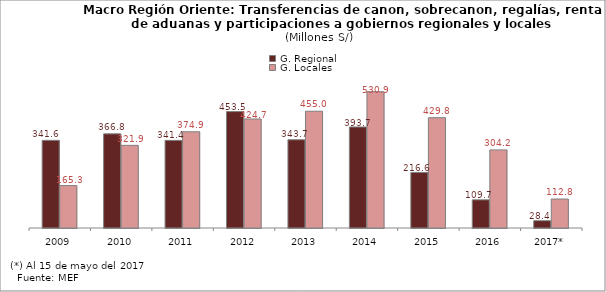
| Category | G. Regional | G. Locales |
|---|---|---|
| 2009 | 341.561 | 165.267 |
| 2010 | 366.783 | 321.948 |
| 2011 | 341.41 | 374.936 |
| 2012 | 453.536 | 424.744 |
| 2013 | 343.727 | 454.969 |
| 2014 | 393.679 | 530.927 |
| 2015 | 216.586 | 429.752 |
| 2016 | 109.703 | 304.224 |
| 2017* | 28.393 | 112.84 |